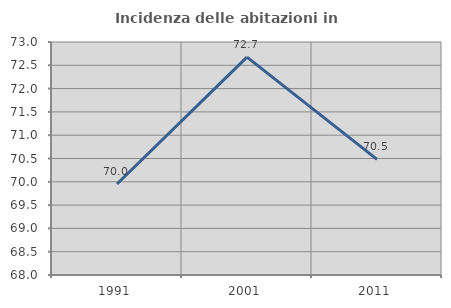
| Category | Incidenza delle abitazioni in proprietà  |
|---|---|
| 1991.0 | 69.952 |
| 2001.0 | 72.675 |
| 2011.0 | 70.481 |